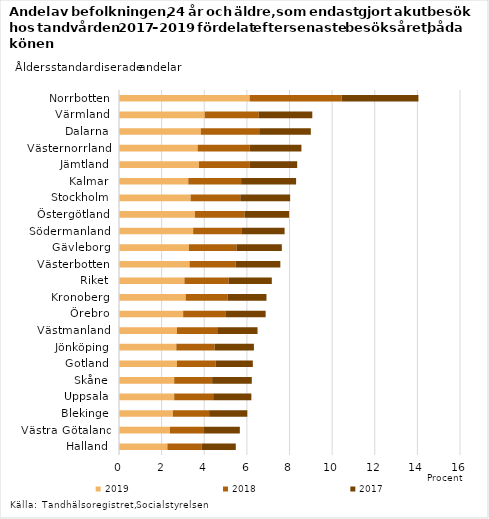
| Category | 2019 | 2018 | 2017 |
|---|---|---|---|
| Halland | 2.27 | 1.61 | 1.6 |
| Västra Götaland | 2.39 | 1.6 | 1.68 |
| Blekinge | 2.53 | 1.7 | 1.79 |
| Uppsala | 2.59 | 1.83 | 1.79 |
| Skåne | 2.59 | 1.78 | 1.86 |
| Gotland | 2.72 | 1.81 | 1.75 |
| Jönköping | 2.69 | 1.8 | 1.84 |
| Västmanland | 2.72 | 1.89 | 1.89 |
| Örebro | 3.01 | 1.98 | 1.89 |
| Kronoberg | 3.13 | 1.96 | 1.83 |
| Riket | 3.07 | 2.07 | 2.03 |
| Västerbotten | 3.31 | 2.16 | 2.1 |
| Gävleborg | 3.28 | 2.23 | 2.13 |
| Södermanland | 3.48 | 2.26 | 2.03 |
| Östergötland | 3.56 | 2.33 | 2.09 |
| Stockholm | 3.36 | 2.33 | 2.34 |
| Kalmar | 3.25 | 2.48 | 2.58 |
| Jämtland | 3.75 | 2.39 | 2.22 |
| Västernorrland | 3.69 | 2.44 | 2.43 |
| Dalarna | 3.84 | 2.74 | 2.42 |
| Värmland | 4.02 | 2.54 | 2.51 |
| Norrbotten | 6.13 | 4.32 | 3.6 |